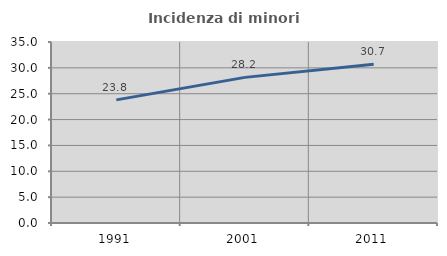
| Category | Incidenza di minori stranieri |
|---|---|
| 1991.0 | 23.81 |
| 2001.0 | 28.161 |
| 2011.0 | 30.712 |